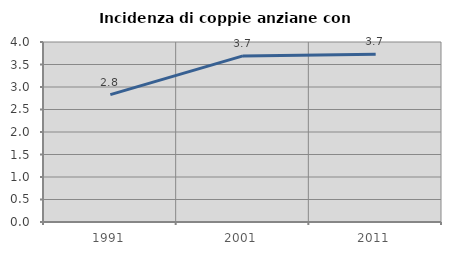
| Category | Incidenza di coppie anziane con figli |
|---|---|
| 1991.0 | 2.831 |
| 2001.0 | 3.69 |
| 2011.0 | 3.727 |